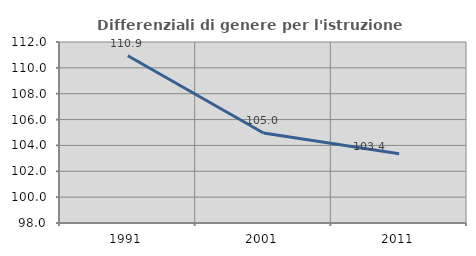
| Category | Differenziali di genere per l'istruzione superiore |
|---|---|
| 1991.0 | 110.936 |
| 2001.0 | 104.964 |
| 2011.0 | 103.362 |